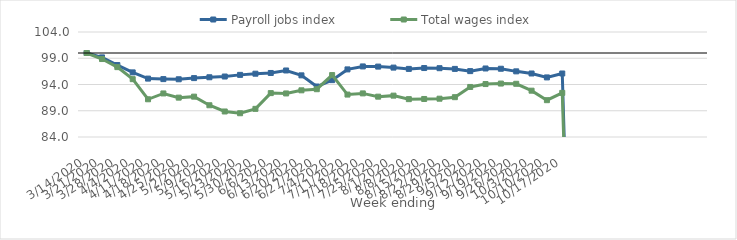
| Category | Payroll jobs index | Total wages index |
|---|---|---|
| 14/03/2020 | 100 | 100 |
| 21/03/2020 | 99.161 | 98.849 |
| 28/03/2020 | 97.705 | 97.309 |
| 04/04/2020 | 96.307 | 95.016 |
| 11/04/2020 | 95.122 | 91.185 |
| 18/04/2020 | 95.03 | 92.295 |
| 25/04/2020 | 94.997 | 91.5 |
| 02/05/2020 | 95.22 | 91.687 |
| 09/05/2020 | 95.378 | 90.047 |
| 16/05/2020 | 95.518 | 88.862 |
| 23/05/2020 | 95.834 | 88.526 |
| 30/05/2020 | 96.058 | 89.362 |
| 06/06/2020 | 96.194 | 92.359 |
| 13/06/2020 | 96.671 | 92.296 |
| 20/06/2020 | 95.743 | 92.89 |
| 27/06/2020 | 93.616 | 93.103 |
| 04/07/2020 | 94.832 | 95.795 |
| 11/07/2020 | 96.877 | 92.083 |
| 18/07/2020 | 97.442 | 92.304 |
| 25/07/2020 | 97.408 | 91.682 |
| 01/08/2020 | 97.219 | 91.879 |
| 08/08/2020 | 96.97 | 91.208 |
| 15/08/2020 | 97.136 | 91.244 |
| 22/08/2020 | 97.106 | 91.296 |
| 29/08/2020 | 96.973 | 91.586 |
| 05/09/2020 | 96.548 | 93.533 |
| 12/09/2020 | 97.053 | 94.084 |
| 19/09/2020 | 97.003 | 94.179 |
| 26/09/2020 | 96.503 | 94.135 |
| 03/10/2020 | 96.098 | 92.822 |
| 10/10/2020 | 95.35 | 91.014 |
| 17/10/2020 | 96.098 | 92.403 |